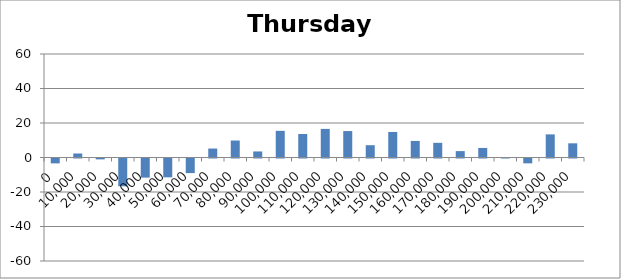
| Category | Thursday 120 |
|---|---|
| 0.0 | -2.819 |
| 10000.0 | 2.329 |
| 20000.0 | -0.5 |
| 30000.0 | -16.095 |
| 40000.0 | -11.086 |
| 50000.0 | -10.919 |
| 60000.0 | -8.462 |
| 70000.0 | 5.19 |
| 80000.0 | 9.838 |
| 90000.0 | 3.514 |
| 100000.0 | 15.457 |
| 110000.0 | 13.633 |
| 120000.0 | 16.576 |
| 130000.0 | 15.338 |
| 140000.0 | 7.124 |
| 150000.0 | 14.805 |
| 160000.0 | 9.605 |
| 170000.0 | 8.51 |
| 180000.0 | 3.7 |
| 190000.0 | 5.538 |
| 200000.0 | 0.076 |
| 210000.0 | -2.81 |
| 220000.0 | 13.407 |
| 230000.0 | 8.22 |